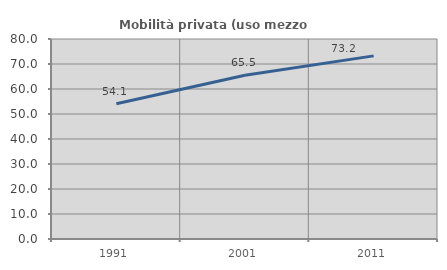
| Category | Mobilità privata (uso mezzo privato) |
|---|---|
| 1991.0 | 54.103 |
| 2001.0 | 65.492 |
| 2011.0 | 73.249 |